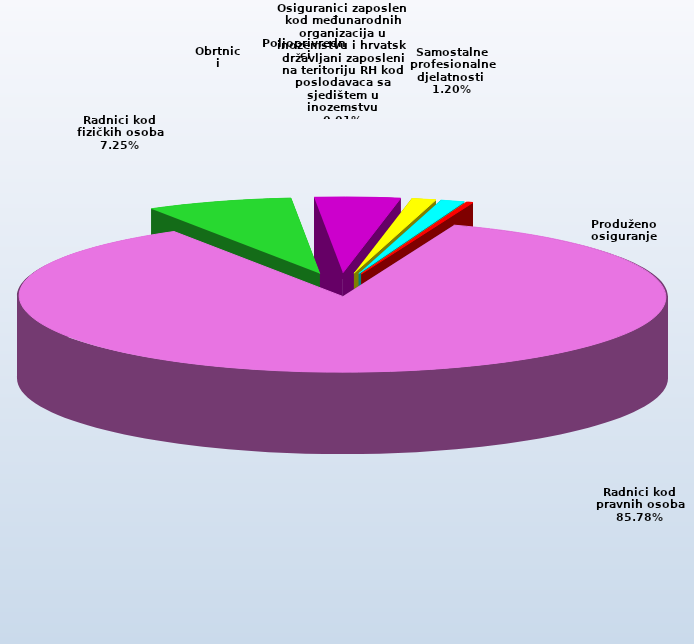
| Category | Series 0 |
|---|---|
| Radnici kod pravnih osoba | 1360262 |
| Radnici kod fizičkih osoba | 114948 |
| Obrtnici | 67442 |
| Poljoprivrednici | 19209 |
| Samostalne profesionalne djelatnosti  | 19006 |
| Osiguranici zaposleni kod međunarodnih organizacija u inozemstvu i hrvatski državljani zaposleni na teritoriju RH kod poslodavaca sa sjedištem u inozemstvu | 84 |
| Produženo osiguranje | 4725 |